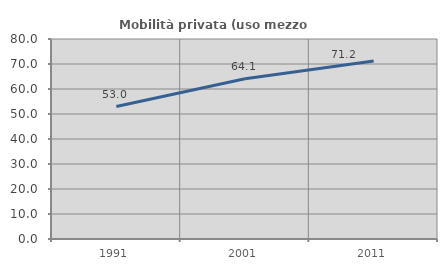
| Category | Mobilità privata (uso mezzo privato) |
|---|---|
| 1991.0 | 52.991 |
| 2001.0 | 64.065 |
| 2011.0 | 71.156 |